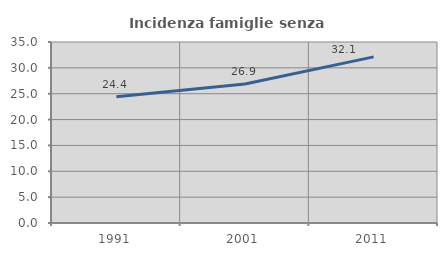
| Category | Incidenza famiglie senza nuclei |
|---|---|
| 1991.0 | 24.413 |
| 2001.0 | 26.868 |
| 2011.0 | 32.119 |